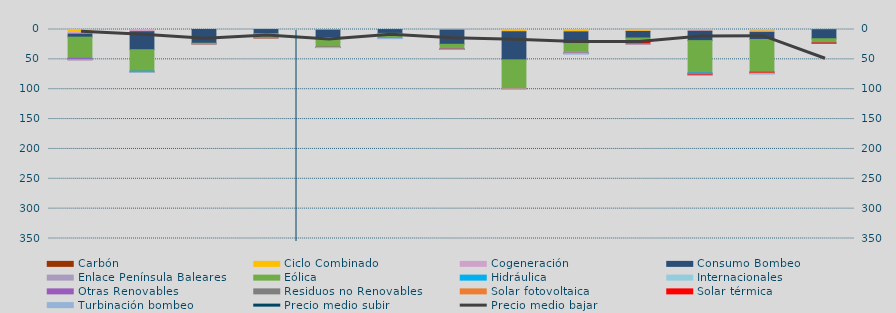
| Category | Carbón | Ciclo Combinado | Cogeneración | Consumo Bombeo | Enlace Península Baleares | Eólica | Hidráulica | Internacionales | Otras Renovables | Residuos no Renovables | Solar fotovoltaica | Solar térmica | Turbinación bombeo |
|---|---|---|---|---|---|---|---|---|---|---|---|---|---|
| 0 |  | 4734 | 2991.4 | 5082.6 | 0 | 34919.2 | 974.6 | 0 | 1593 | 0 | 127.6 | 75.4 | 456.5 |
| 1 |  | 1002.5 | 2760.3 | 30103.8 | 0 | 35894 | 414.2 | 0 | 1401.5 | 0 | 44.9 | 0 | 291.7 |
| 2 |  | 0 | 0 | 23016.4 | 0 | 876.3 | 57 | 0 | 0 | 0 | 2.3 | 24.4 | 80 |
| 3 |  | 0 | 75.3 | 6919 | 0 | 7092 | 5.4 | 0 | 35 | 0 | 9.9 | 0 | 0 |
| 4 |  | 961.7 | 104.4 | 12588.9 | 171.2 | 15813.4 | 165.3 | 0 | 58 | 0 | 94.9 | 202.5 | 300 |
| 5 |  | 25 | 116.4 | 6359.7 | 0 | 7846.5 | 596.6 | 0 | 0 | 0 | 0 | 0 | 449 |
| 6 |  | 0 | 1089.4 | 23705.1 | 0 | 7599.2 | 452.8 | 0 | 116.6 | 75.4 | 17.6 | 85.1 | 49.3 |
| 7 |  | 3086.3 | 728.2 | 47015.3 | 0 | 47937 | 126 | 0 | 326.6 | 122.8 | 396.6 | 0 | 609.8 |
| 8 |  | 3148.4 | 881.6 | 19374 | 0 | 14568.2 | 211.4 | 1000 | 609.5 | 107.9 | 251.7 | 26.5 | 1084 |
| 9 |  | 2750.7 | 621.4 | 10873.4 | 0 | 4830.6 | 121.8 | 0 | 347.3 | 15 | 417.8 | 4272.2 | 206 |
| 10 |  | 1918.5 | 1097.9 | 15644.8 | 0 | 53940 | 707.2 | 0 | 770.3 | 169.1 | 860.9 | 1341.3 | 386.7 |
| 11 |  | 2609.1 | 2181.9 | 11984 | 0 | 53740.1 | 489.7 | 0 | 1338.8 | 61.2 | 254.1 | 740.7 | 1229 |
| 12 |  | 263.3 | 58 | 15135.8 | 0 | 6986.8 | 204.2 | 0 | 0 | 0 | 19.1 | 10 | 0 |